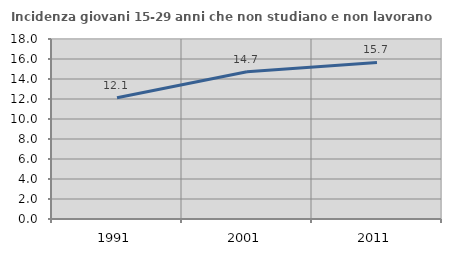
| Category | Incidenza giovani 15-29 anni che non studiano e non lavorano  |
|---|---|
| 1991.0 | 12.129 |
| 2001.0 | 14.718 |
| 2011.0 | 15.66 |